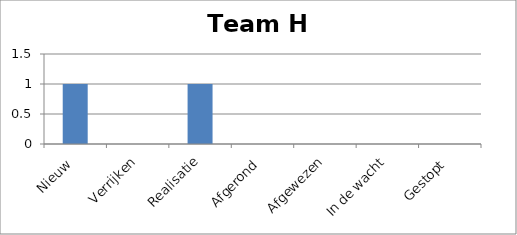
| Category | Team H |
|---|---|
| Nieuw | 1 |
| Verrijken | 0 |
| Realisatie | 1 |
| Afgerond | 0 |
| Afgewezen | 0 |
| In de wacht | 0 |
| Gestopt | 0 |